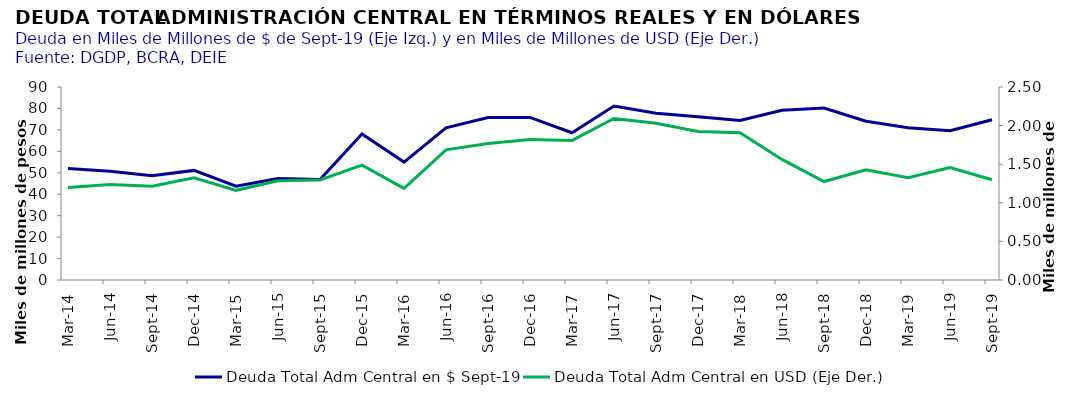
| Category | Deuda Total Adm Central en $ Sept-19 |
|---|---|
| 2014-03-31 | 52041214582.004 |
| 2014-06-30 | 50756119817.805 |
| 2014-09-30 | 48569513491.254 |
| 2014-12-31 | 51104212033.849 |
| 2015-03-31 | 43756412254.705 |
| 2015-06-30 | 47335404387.448 |
| 2015-09-30 | 46824889335.958 |
| 2015-12-31 | 68075683564.94 |
| 2016-03-31 | 55004777488.092 |
| 2016-06-30 | 70943369407.091 |
| 2016-09-30 | 75809773204.825 |
| 2016-12-31 | 75829275182.949 |
| 2017-03-31 | 68655837870.964 |
| 2017-06-30 | 81128869179.159 |
| 2017-09-30 | 77793341498.366 |
| 2017-12-31 | 76156759225.933 |
| 2018-03-31 | 74425635926.337 |
| 2018-06-30 | 79188606960.319 |
| 2018-09-30 | 80172469760.965 |
| 2018-12-31 | 74031017766.239 |
| 2019-03-31 | 70965149524.138 |
| 2019-06-30 | 69635542067.191 |
| 2019-09-30 | 74754609257.101 |